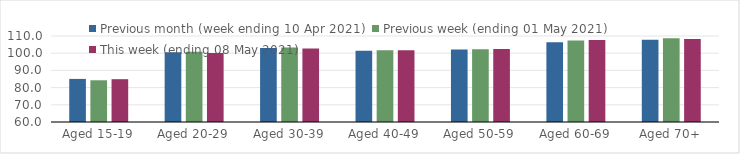
| Category | Previous month (week ending 10 Apr 2021) | Previous week (ending 01 May 2021) | This week (ending 08 May 2021) |
|---|---|---|---|
| Aged 15-19 | 85.05 | 84.26 | 84.89 |
| Aged 20-29 | 100.61 | 100.79 | 100.06 |
| Aged 30-39 | 103.08 | 103.28 | 102.72 |
| Aged 40-49 | 101.38 | 101.76 | 101.72 |
| Aged 50-59 | 102.09 | 102.33 | 102.39 |
| Aged 60-69 | 106.37 | 107.39 | 107.67 |
| Aged 70+ | 107.75 | 108.66 | 108.31 |